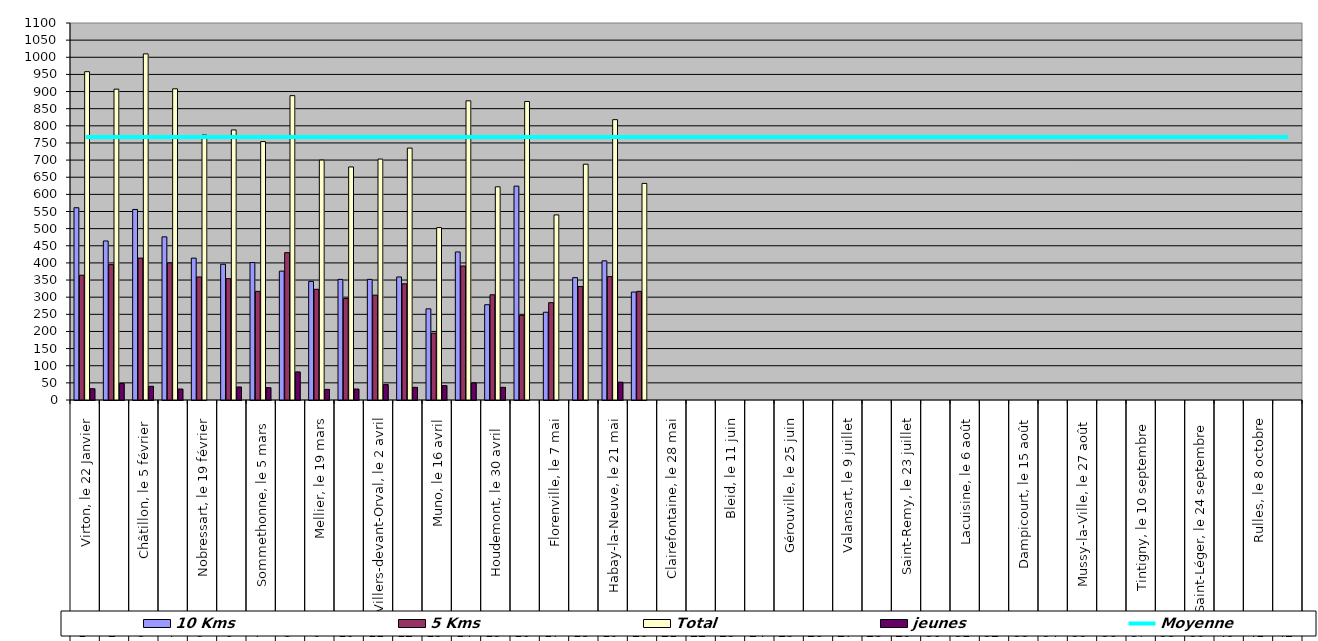
| Category | 10 Kms | 5 Kms | Total | jeunes |
|---|---|---|---|---|
| 0 | 561 | 364 | 958 | 33 |
| 1 | 464 | 395 | 907 | 48 |
| 2 | 556 | 414 | 1010 | 40 |
| 3 | 476 | 400 | 908 | 32 |
| 4 | 414 | 359 | 773 | 0 |
| 5 | 396 | 354 | 788 | 38 |
| 6 | 401 | 317 | 754 | 36 |
| 7 | 376 | 430 | 888 | 82 |
| 8 | 346 | 323 | 700 | 31 |
| 9 | 352 | 296 | 680 | 32 |
| 10 | 352 | 306 | 703 | 45 |
| 11 | 359 | 339 | 735 | 37 |
| 12 | 266 | 195 | 503 | 42 |
| 13 | 432 | 391 | 873 | 50 |
| 14 | 278 | 307 | 622 | 37 |
| 15 | 624 | 247 | 871 | 0 |
| 16 | 256 | 284 | 540 | 0 |
| 17 | 357 | 331 | 688 | 0 |
| 18 | 406 | 360 | 818 | 52 |
| 19 | 315 | 317 | 632 | 0 |
| 20 | 0 | 0 | 0 | 0 |
| 21 | 0 | 0 | 0 | 0 |
| 22 | 0 | 0 | 0 | 0 |
| 23 | 0 | 0 | 0 | 0 |
| 24 | 0 | 0 | 0 | 0 |
| 25 | 0 | 0 | 0 | 0 |
| 26 | 0 | 0 | 0 | 0 |
| 27 | 0 | 0 | 0 | 0 |
| 28 | 0 | 0 | 0 | 0 |
| 29 | 0 | 0 | 0 | 0 |
| 30 | 0 | 0 | 0 | 0 |
| 31 | 0 | 0 | 0 | 0 |
| 32 | 0 | 0 | 0 | 0 |
| 33 | 0 | 0 | 0 | 0 |
| 34 | 0 | 0 | 0 | 0 |
| 35 | 0 | 0 | 0 | 0 |
| 36 | 0 | 0 | 0 | 0 |
| 37 | 0 | 0 | 0 | 0 |
| 38 | 0 | 0 | 0 | 0 |
| 39 | 0 | 0 | 0 | 0 |
| 40 | 0 | 0 | 0 | 0 |
| 41 | 0 | 0 | 0 | 0 |